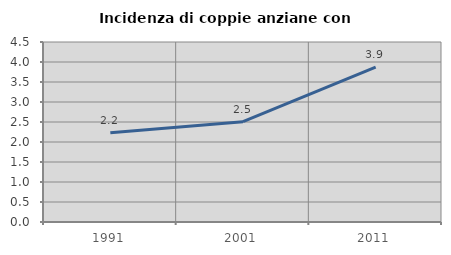
| Category | Incidenza di coppie anziane con figli |
|---|---|
| 1991.0 | 2.23 |
| 2001.0 | 2.507 |
| 2011.0 | 3.874 |